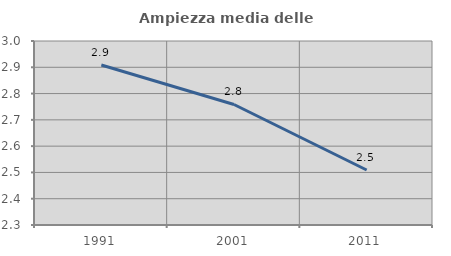
| Category | Ampiezza media delle famiglie |
|---|---|
| 1991.0 | 2.909 |
| 2001.0 | 2.758 |
| 2011.0 | 2.509 |